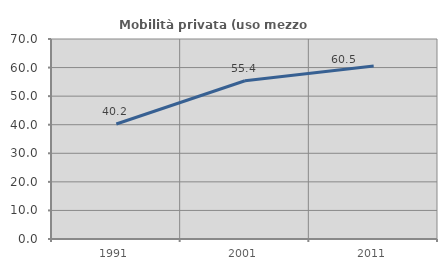
| Category | Mobilità privata (uso mezzo privato) |
|---|---|
| 1991.0 | 40.247 |
| 2001.0 | 55.404 |
| 2011.0 | 60.523 |